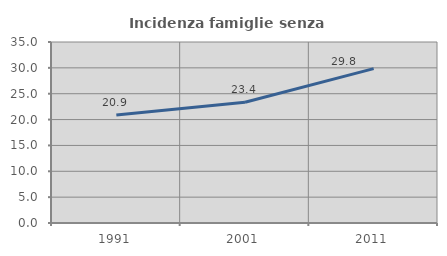
| Category | Incidenza famiglie senza nuclei |
|---|---|
| 1991.0 | 20.896 |
| 2001.0 | 23.36 |
| 2011.0 | 29.845 |